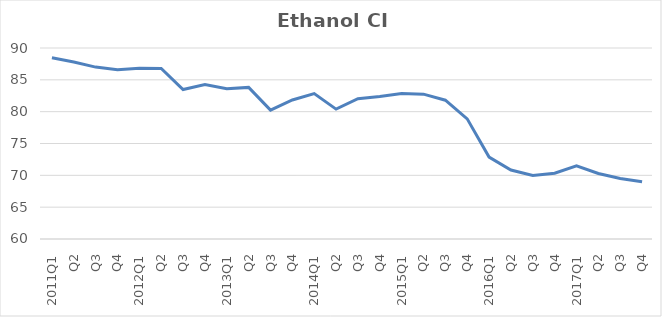
| Category | Ethanol CI Avg |
|---|---|
| 2011Q1 | 88.48 |
| Q2 | 87.8 |
| Q3 | 87 |
| Q4 | 86.6 |
| 2012Q1 | 86.8 |
| Q2 | 86.78 |
| Q3 | 83.48 |
| Q4 | 84.27 |
| 2013Q1 | 83.6 |
| Q2 | 83.81 |
| Q3 | 80.24 |
| Q4 | 81.84 |
| 2014Q1 | 82.83 |
| Q2 | 80.4 |
| Q3 | 82.03 |
| Q4 | 82.38 |
| 2015Q1 | 82.86 |
| Q2 | 82.75 |
| Q3 | 81.8 |
| Q4 | 78.87 |
| 2016Q1 | 72.87 |
| Q2 | 70.83 |
| Q3 | 69.98 |
| Q4 | 70.34 |
| 2017Q1 | 71.48 |
| Q2 | 70.29 |
| Q3 | 69.51 |
| Q4 | 68.98 |